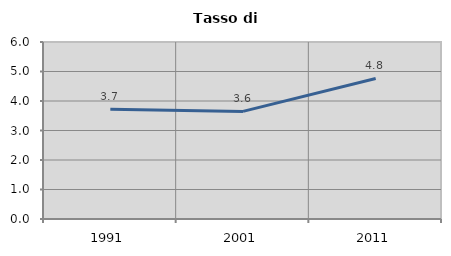
| Category | Tasso di disoccupazione   |
|---|---|
| 1991.0 | 3.721 |
| 2001.0 | 3.647 |
| 2011.0 | 4.765 |